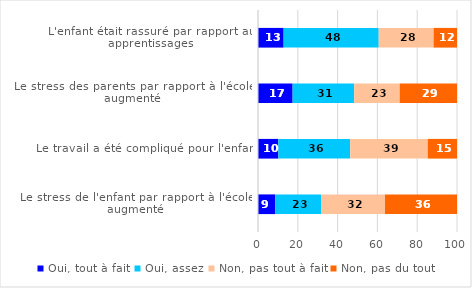
| Category | Oui, tout à fait | Oui, assez | Non, pas tout à fait | Non, pas du tout |
|---|---|---|---|---|
| L'enfant était rassuré par rapport aux apprentissages | 12.88 | 47.78 | 27.58 | 11.76 |
| Le stress des parents par rapport à l'école a augmenté | 17.39 | 30.95 | 22.87 | 28.8 |
| Le travail a été compliqué pour l'enfant | 10.21 | 36.12 | 38.96 | 14.7 |
| Le stress de l'enfant par rapport à l'école a augmenté | 8.61 | 23.05 | 32.17 | 36.17 |